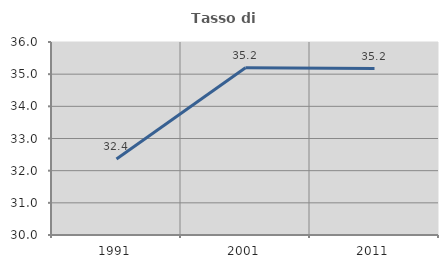
| Category | Tasso di occupazione   |
|---|---|
| 1991.0 | 32.364 |
| 2001.0 | 35.198 |
| 2011.0 | 35.172 |